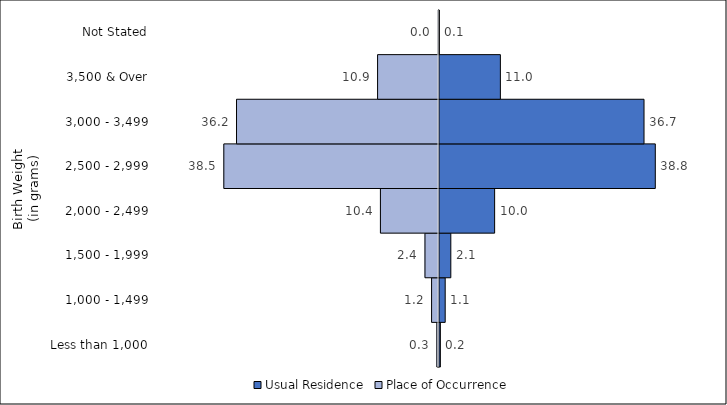
| Category | Usual Residence | Place of Occurrence |
|---|---|---|
| Less than 1,000 | 0.244 | -0.296 |
| 1,000 - 1,499 | 1.11 | -1.239 |
| 1,500 - 1,999 | 2.118 | -2.423 |
| 2,000 - 2,499 | 9.969 | -10.406 |
| 2,500 - 2,999 | 38.765 | -38.473 |
| 3,000 - 3,499 | 36.742 | -36.198 |
| 3,500 & Over | 11.002 | -10.918 |
| Not Stated | 0.051 | -0.049 |